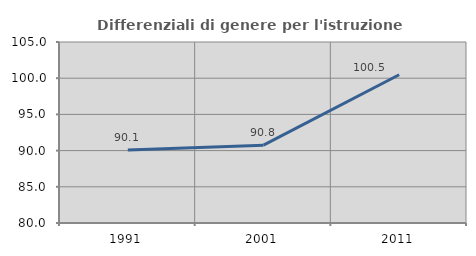
| Category | Differenziali di genere per l'istruzione superiore |
|---|---|
| 1991.0 | 90.091 |
| 2001.0 | 90.755 |
| 2011.0 | 100.473 |